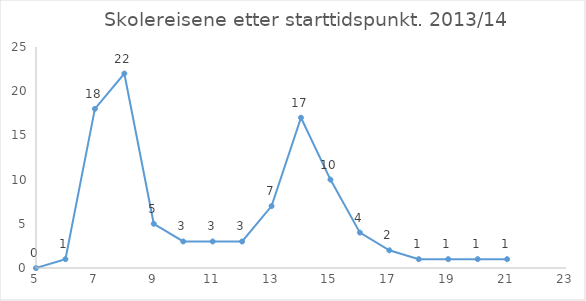
| Category | Andel reiser (i %) |
|---|---|
| 5.0 | 0 |
| 6.0 | 1 |
| 7.0 | 18 |
| 8.0 | 22 |
| 9.0 | 5 |
| 10.0 | 3 |
| 11.0 | 3 |
| 12.0 | 3 |
| 13.0 | 7 |
| 14.0 | 17 |
| 15.0 | 10 |
| 16.0 | 4 |
| 17.0 | 2 |
| 18.0 | 1 |
| 19.0 | 1 |
| 20.0 | 1 |
| 21.0 | 1 |